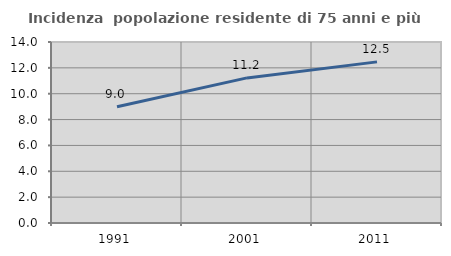
| Category | Incidenza  popolazione residente di 75 anni e più |
|---|---|
| 1991.0 | 8.992 |
| 2001.0 | 11.224 |
| 2011.0 | 12.462 |